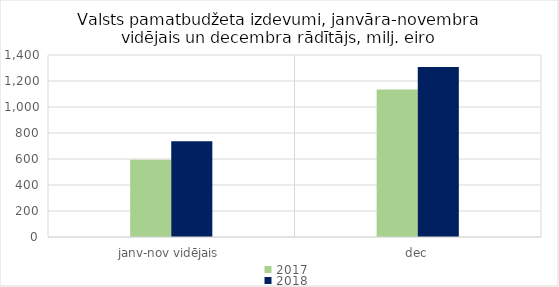
| Category | 2017 | 2018 |
|---|---|---|
| janv-nov vidējais | 593880.982 | 736548.581 |
| dec | 1134353.728 | 1308324.606 |